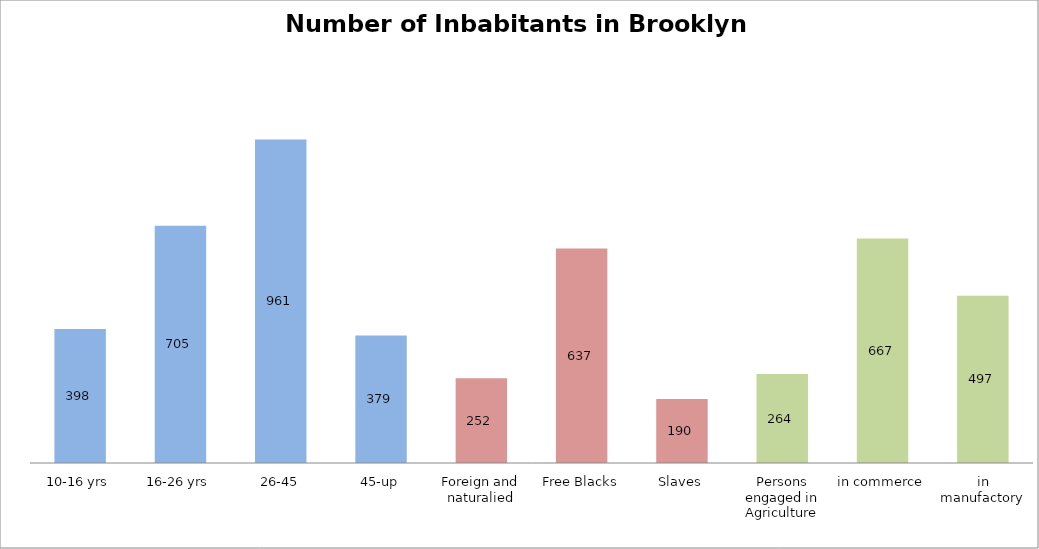
| Category | Series 0 | Series 1 | Series 2 | Series 3 | Series 4 |
|---|---|---|---|---|---|
| 10-16 yrs |  |  | 398 |  |  |
| 16-26 yrs |  |  | 705 |  |  |
| 26-45 |  |  | 961 |  |  |
| 45-up |  |  | 379 |  |  |
| Foreign and naturalied |  |  | 252 |  |  |
| Free Blacks |  |  | 637 |  |  |
| Slaves |  |  | 190 |  |  |
| Persons engaged in Agriculture |  |  | 264 |  |  |
| in commerce |  |  | 667 |  |  |
| in manufactory |  |  | 497 |  |  |